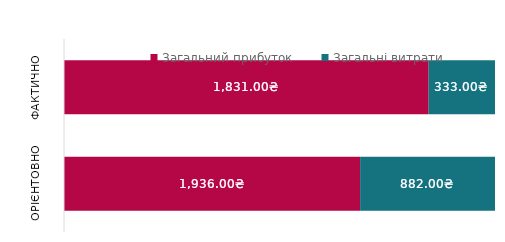
| Category | Загальний прибуток | Загальні витрати |
|---|---|---|
| Орієнтовно | 1936 | 882 |
| Фактично | 1831 | 333 |